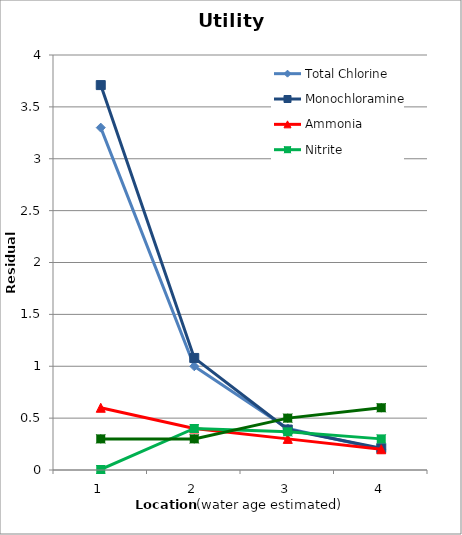
| Category | Total Chlorine | Monochloramine | Ammonia | Nitrite | Nitrate |
|---|---|---|---|---|---|
| 0 | 3.3 | 3.71 | 0.6 | 0.005 | 0.3 |
| 1 | 1 | 1.08 | 0.4 | 0.4 | 0.3 |
| 2 | 0.4 | 0.39 | 0.3 | 0.368 | 0.5 |
| 3 | 0.2 | 0.21 | 0.2 | 0.3 | 0.6 |